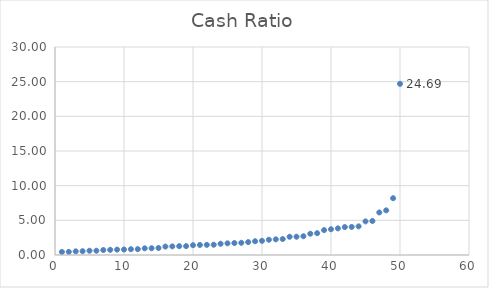
| Category | Series 0 |
|---|---|
| 0 | 0.441 |
| 1 | 0.452 |
| 2 | 0.524 |
| 3 | 0.548 |
| 4 | 0.615 |
| 5 | 0.618 |
| 6 | 0.715 |
| 7 | 0.746 |
| 8 | 0.776 |
| 9 | 0.79 |
| 10 | 0.838 |
| 11 | 0.843 |
| 12 | 0.96 |
| 13 | 0.975 |
| 14 | 1.011 |
| 15 | 1.219 |
| 16 | 1.246 |
| 17 | 1.276 |
| 18 | 1.282 |
| 19 | 1.414 |
| 20 | 1.446 |
| 21 | 1.464 |
| 22 | 1.481 |
| 23 | 1.624 |
| 24 | 1.682 |
| 25 | 1.725 |
| 26 | 1.759 |
| 27 | 1.861 |
| 28 | 1.985 |
| 29 | 2.044 |
| 30 | 2.198 |
| 31 | 2.263 |
| 32 | 2.301 |
| 33 | 2.629 |
| 34 | 2.638 |
| 35 | 2.707 |
| 36 | 3.066 |
| 37 | 3.145 |
| 38 | 3.592 |
| 39 | 3.715 |
| 40 | 3.84 |
| 41 | 4.026 |
| 42 | 4.049 |
| 43 | 4.13 |
| 44 | 4.846 |
| 45 | 4.908 |
| 46 | 6.135 |
| 47 | 6.439 |
| 48 | 8.19 |
| 49 | 24.688 |